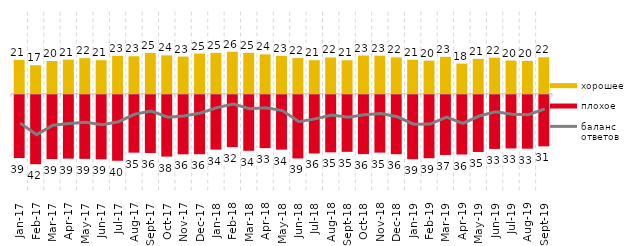
| Category | хорошее | плохое |
|---|---|---|
| 2017-01-01 | 20.75 | -38.65 |
| 2017-02-01 | 17.45 | -42.4 |
| 2017-03-01 | 20.05 | -39.25 |
| 2017-04-01 | 20.9 | -39 |
| 2017-05-01 | 21.8 | -39.15 |
| 2017-06-01 | 20.55 | -39.4 |
| 2017-07-01 | 23.25 | -40.3 |
| 2017-08-01 | 22.95 | -35.35 |
| 2017-09-01 | 25 | -35.55 |
| 2017-10-01 | 23.5 | -37.75 |
| 2017-11-01 | 22.8 | -36.35 |
| 2017-12-01 | 24.6 | -36.3 |
| 2018-01-01 | 25.05 | -33.5 |
| 2018-02-01 | 25.7 | -31.95 |
| 2018-03-01 | 25.05 | -34.2 |
| 2018-04-01 | 24.1 | -32.6 |
| 2018-05-01 | 23.25 | -33.5 |
| 2018-06-01 | 21.85 | -38.9 |
| 2018-07-01 | 20.55 | -35.85 |
| 2018-08-01 | 22.2 | -35.15 |
| 2018-09-01 | 20.5 | -34.85 |
| 2018-10-01 | 23.4 | -36.25 |
| 2018-11-01 | 23.303 | -35.329 |
| 2018-12-01 | 22.25 | -36.3 |
| 2019-01-01 | 20.8 | -39.35 |
| 2019-02-01 | 20.3 | -38.75 |
| 2019-03-01 | 22.576 | -36.748 |
| 2019-04-01 | 18.465 | -36.485 |
| 2019-05-01 | 21.347 | -34.918 |
| 2019-06-01 | 22.095 | -33.067 |
| 2019-07-01 | 20.347 | -32.772 |
| 2019-08-01 | 20.13 | -32.917 |
| 2019-09-01 | 22.327 | -31.485 |